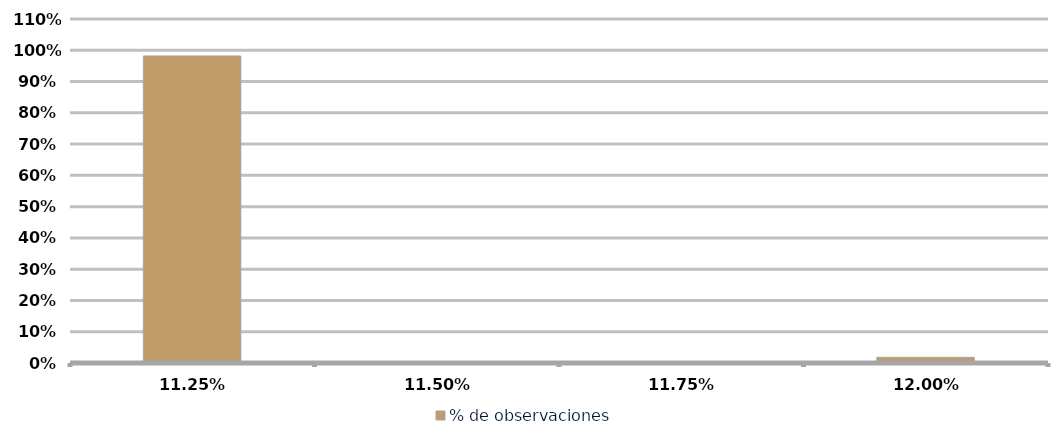
| Category | % de observaciones  |
|---|---|
| 0.1125 | 0.982 |
| 0.115 | 0 |
| 0.11750000000000001 | 0 |
| 0.12000000000000001 | 0.018 |